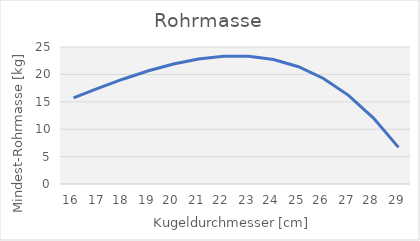
| Category | Series 0 |
|---|---|
| 16.0 | 15.705 |
| 17.0 | 17.492 |
| 18.0 | 19.167 |
| 19.0 | 20.664 |
| 20.0 | 21.91 |
| 21.0 | 22.827 |
| 22.0 | 23.33 |
| 23.0 | 23.326 |
| 24.0 | 22.717 |
| 25.0 | 21.397 |
| 26.0 | 19.255 |
| 27.0 | 16.172 |
| 28.0 | 12.024 |
| 29.0 | 6.68 |